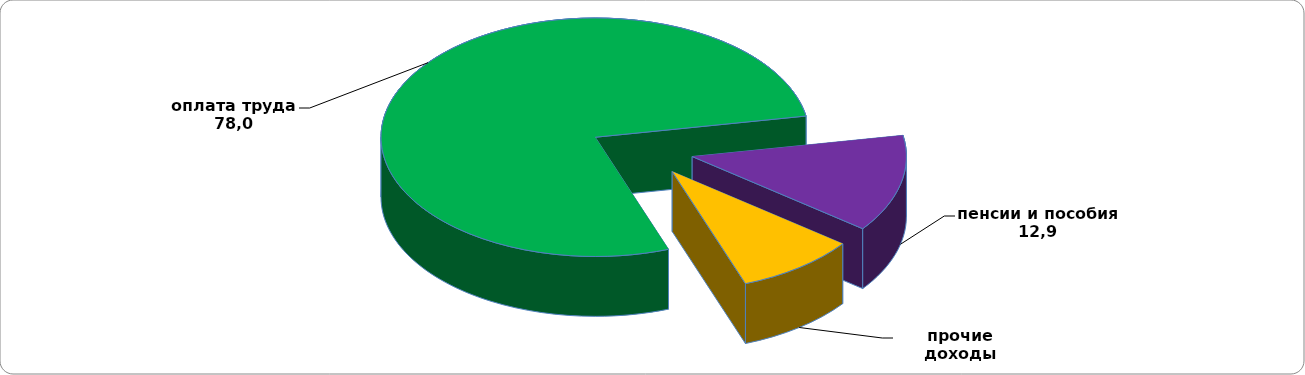
| Category | Series 0 |
|---|---|
| оплата труда | 77.74 |
| пенсии и пособия | 13.2 |
| прочие доходы | 9.1 |